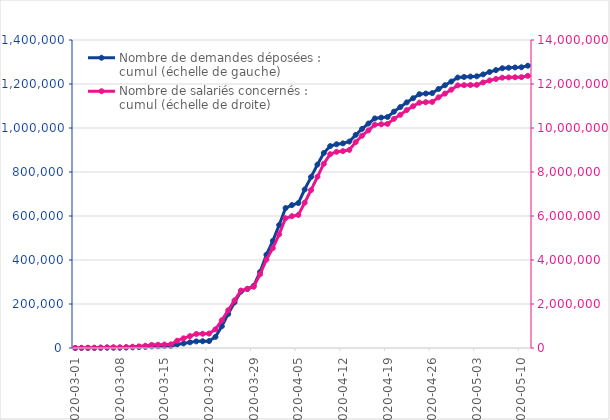
| Category | Nombre de demandes déposées : cumul (échelle de gauche) |
|---|---|
| 2020-03-01 | 1 |
| 2020-03-02 | 129 |
| 2020-03-03 | 295 |
| 2020-03-04 | 497 |
| 2020-03-05 | 806 |
| 2020-03-06 | 1284 |
| 2020-03-07 | 1309 |
| 2020-03-08 | 1326 |
| 2020-03-09 | 1962 |
| 2020-03-10 | 2813 |
| 2020-03-11 | 3928 |
| 2020-03-12 | 5483 |
| 2020-03-13 | 7266 |
| 2020-03-14 | 7733 |
| 2020-03-15 | 8383 |
| 2020-03-16 | 8708 |
| 2020-03-17 | 16206 |
| 2020-03-18 | 20767 |
| 2020-03-19 | 25810 |
| 2020-03-20 | 30053 |
| 2020-03-21 | 30704 |
| 2020-03-22 | 31518 |
| 2020-03-23 | 50512 |
| 2020-03-24 | 98687 |
| 2020-03-25 | 154529 |
| 2020-03-26 | 207306 |
| 2020-03-27 | 256687 |
| 2020-03-28 | 268301 |
| 2020-03-29 | 282467 |
| 2020-03-30 | 345658 |
| 2020-03-31 | 424248 |
| 2020-04-01 | 486684 |
| 2020-04-02 | 559145 |
| 2020-04-03 | 635973 |
| 2020-04-04 | 649654 |
| 2020-04-05 | 658850 |
| 2020-04-06 | 720477 |
| 2020-04-07 | 777325 |
| 2020-04-08 | 833593 |
| 2020-04-09 | 886320 |
| 2020-04-10 | 917785 |
| 2020-04-11 | 925983 |
| 2020-04-12 | 930169 |
| 2020-04-13 | 938382 |
| 2020-04-14 | 968479 |
| 2020-04-15 | 995965 |
| 2020-04-16 | 1020237 |
| 2020-04-17 | 1043573 |
| 2020-04-18 | 1047236 |
| 2020-04-19 | 1049967 |
| 2020-04-20 | 1074180 |
| 2020-04-21 | 1095274 |
| 2020-04-22 | 1116402 |
| 2020-04-23 | 1135173 |
| 2020-04-24 | 1153678 |
| 2020-04-25 | 1156662 |
| 2020-04-26 | 1158657 |
| 2020-04-27 | 1177316 |
| 2020-04-28 | 1194354 |
| 2020-04-29 | 1211256 |
| 2020-04-30 | 1229303 |
| 2020-05-01 | 1231927 |
| 2020-05-02 | 1233693 |
| 2020-05-03 | 1235110 |
| 2020-05-04 | 1243710 |
| 2020-05-05 | 1254584 |
| 2020-05-06 | 1263240 |
| 2020-05-07 | 1271533 |
| 2020-05-08 | 1273789 |
| 2020-05-09 | 1275139 |
| 2020-05-10 | 1276072 |
| 2020-05-11 | 1283157 |